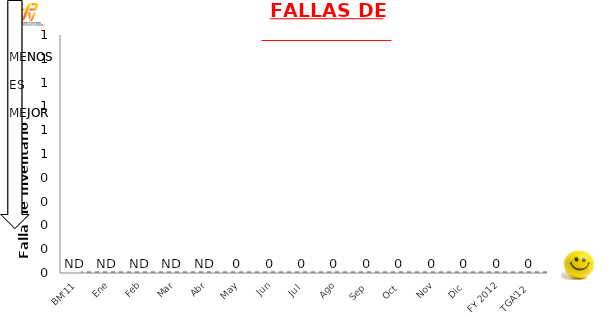
| Category | Mensual |
|---|---|
| BM'11 | 0 |
| Ene | 0 |
| Feb | 0 |
| Mar | 0 |
| Abr | 0 |
| May | 0 |
| Jun | 0 |
| Jul | 0 |
| Ago | 0 |
| Sep | 0 |
| Oct | 0 |
| Nov | 0 |
| Dic | 0 |
| FY 2012 | 0 |
| TGA'12 | 0 |